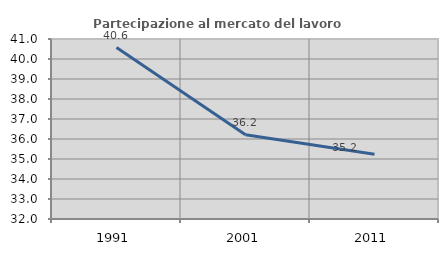
| Category | Partecipazione al mercato del lavoro  femminile |
|---|---|
| 1991.0 | 40.57 |
| 2001.0 | 36.218 |
| 2011.0 | 35.241 |